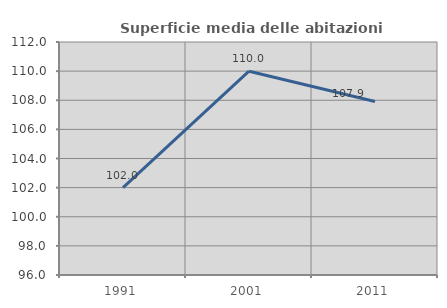
| Category | Superficie media delle abitazioni occupate |
|---|---|
| 1991.0 | 101.997 |
| 2001.0 | 109.993 |
| 2011.0 | 107.915 |